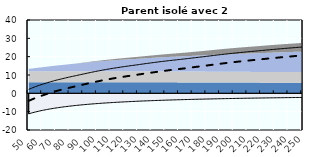
| Category | Coin fiscal moyen (somme des composantes) | Taux moyen d'imposition net en % du salaire brut |
|---|---|---|
| 50.0 | 2.171 | -4.09 |
| 51.0 | 2.46 | -3.783 |
| 52.0 | 2.765 | -3.458 |
| 53.0 | 3.078 | -3.125 |
| 54.0 | 3.364 | -2.821 |
| 55.0 | 3.654 | -2.512 |
| 56.0 | 3.92 | -2.229 |
| 57.0 | 4.19 | -1.941 |
| 58.0 | 4.452 | -1.663 |
| 59.0 | 4.69 | -1.41 |
| 60.0 | 4.934 | -1.15 |
| 61.0 | 5.171 | -0.898 |
| 62.0 | 5.386 | -0.669 |
| 63.0 | 5.624 | -0.416 |
| 64.0 | 5.867 | -0.158 |
| 65.0 | 6.086 | 0.076 |
| 66.0 | 6.315 | 0.319 |
| 67.0 | 6.537 | 0.555 |
| 68.0 | 6.737 | 0.768 |
| 69.0 | 6.946 | 0.991 |
| 70.0 | 7.149 | 1.207 |
| 71.0 | 7.332 | 1.402 |
| 72.0 | 7.511 | 1.591 |
| 73.0 | 7.698 | 1.79 |
| 74.0 | 7.866 | 1.969 |
| 75.0 | 8.046 | 2.161 |
| 76.0 | 8.227 | 2.353 |
| 77.0 | 8.403 | 2.54 |
| 78.0 | 8.59 | 2.74 |
| 79.0 | 8.757 | 2.917 |
| 80.0 | 8.92 | 3.09 |
| 81.0 | 9.093 | 3.275 |
| 82.0 | 9.248 | 3.44 |
| 83.0 | 9.399 | 3.601 |
| 84.0 | 9.561 | 3.773 |
| 85.0 | 9.714 | 3.936 |
| 86.0 | 9.898 | 4.132 |
| 87.0 | 10.06 | 4.304 |
| 88.0 | 10.219 | 4.473 |
| 89.0 | 10.391 | 4.656 |
| 90.0 | 10.542 | 4.817 |
| 91.0 | 10.69 | 4.974 |
| 92.0 | 10.86 | 5.155 |
| 93.0 | 11.019 | 5.324 |
| 94.0 | 11.175 | 5.49 |
| 95.0 | 11.345 | 5.671 |
| 96.0 | 11.494 | 5.829 |
| 97.0 | 11.64 | 5.984 |
| 98.0 | 11.8 | 6.155 |
| 99.0 | 11.94 | 6.304 |
| 100.0 | 12.095 | 6.469 |
| 101.0 | 12.237 | 6.62 |
| 102.0 | 12.376 | 6.768 |
| 103.0 | 12.529 | 6.931 |
| 104.0 | 12.662 | 7.073 |
| 105.0 | 12.793 | 7.212 |
| 106.0 | 12.938 | 7.366 |
| 107.0 | 13.064 | 7.5 |
| 108.0 | 13.187 | 7.631 |
| 109.0 | 13.325 | 7.777 |
| 110.0 | 13.443 | 7.904 |
| 111.0 | 13.576 | 8.045 |
| 112.0 | 13.69 | 8.167 |
| 113.0 | 13.803 | 8.286 |
| 114.0 | 13.929 | 8.42 |
| 115.0 | 14.037 | 8.536 |
| 116.0 | 14.144 | 8.649 |
| 117.0 | 14.264 | 8.776 |
| 118.0 | 14.368 | 8.887 |
| 119.0 | 14.475 | 9.002 |
| 120.0 | 14.596 | 9.13 |
| 121.0 | 14.7 | 9.241 |
| 122.0 | 14.817 | 9.366 |
| 123.0 | 14.917 | 9.472 |
| 124.0 | 15.016 | 9.577 |
| 125.0 | 15.128 | 9.696 |
| 126.0 | 15.223 | 9.797 |
| 127.0 | 15.317 | 9.897 |
| 128.0 | 15.424 | 10.011 |
| 129.0 | 15.522 | 10.116 |
| 130.0 | 15.624 | 10.224 |
| 131.0 | 15.74 | 10.348 |
| 132.0 | 15.839 | 10.453 |
| 133.0 | 15.952 | 10.573 |
| 134.0 | 16.051 | 10.678 |
| 135.0 | 16.15 | 10.784 |
| 136.0 | 16.265 | 10.906 |
| 137.0 | 16.361 | 11.008 |
| 138.0 | 16.457 | 11.11 |
| 139.0 | 16.566 | 11.226 |
| 140.0 | 16.658 | 11.325 |
| 141.0 | 16.75 | 11.421 |
| 142.0 | 16.855 | 11.533 |
| 143.0 | 16.958 | 11.644 |
| 144.0 | 17.045 | 11.736 |
| 145.0 | 17.146 | 11.844 |
| 146.0 | 17.246 | 11.95 |
| 147.0 | 17.33 | 12.039 |
| 148.0 | 17.426 | 12.145 |
| 149.0 | 17.52 | 12.248 |
| 150.0 | 17.598 | 12.334 |
| 151.0 | 17.69 | 12.436 |
| 152.0 | 17.781 | 12.535 |
| 153.0 | 17.87 | 12.634 |
| 154.0 | 17.944 | 12.715 |
| 155.0 | 18.032 | 12.811 |
| 156.0 | 18.118 | 12.906 |
| 157.0 | 18.189 | 12.984 |
| 158.0 | 18.275 | 13.079 |
| 159.0 | 18.363 | 13.176 |
| 160.0 | 18.436 | 13.256 |
| 161.0 | 18.522 | 13.35 |
| 162.0 | 18.607 | 13.444 |
| 163.0 | 18.692 | 13.536 |
| 164.0 | 18.761 | 13.612 |
| 165.0 | 18.85 | 13.71 |
| 166.0 | 18.943 | 13.811 |
| 167.0 | 19.022 | 13.898 |
| 168.0 | 19.117 | 14.001 |
| 169.0 | 19.211 | 14.104 |
| 170.0 | 19.304 | 14.205 |
| 171.0 | 19.38 | 14.289 |
| 172.0 | 19.471 | 14.388 |
| 173.0 | 19.563 | 14.488 |
| 174.0 | 19.641 | 14.573 |
| 175.0 | 19.733 | 14.674 |
| 176.0 | 19.825 | 14.773 |
| 177.0 | 19.9 | 14.855 |
| 178.0 | 19.993 | 14.957 |
| 179.0 | 20.087 | 15.058 |
| 180.0 | 20.182 | 15.162 |
| 181.0 | 20.262 | 15.249 |
| 182.0 | 20.359 | 15.354 |
| 183.0 | 20.457 | 15.461 |
| 184.0 | 20.538 | 15.549 |
| 185.0 | 20.635 | 15.653 |
| 186.0 | 20.73 | 15.757 |
| 187.0 | 20.825 | 15.859 |
| 188.0 | 20.902 | 15.943 |
| 189.0 | 20.994 | 16.044 |
| 190.0 | 21.086 | 16.143 |
| 191.0 | 21.161 | 16.224 |
| 192.0 | 21.25 | 16.321 |
| 193.0 | 21.339 | 16.418 |
| 194.0 | 21.411 | 16.496 |
| 195.0 | 21.499 | 16.591 |
| 196.0 | 21.585 | 16.684 |
| 197.0 | 21.67 | 16.777 |
| 198.0 | 21.739 | 16.852 |
| 199.0 | 21.823 | 16.942 |
| 200.0 | 21.906 | 17.032 |
| 201.0 | 21.973 | 17.105 |
| 202.0 | 22.054 | 17.193 |
| 203.0 | 22.135 | 17.28 |
| 204.0 | 22.214 | 17.367 |
| 205.0 | 22.279 | 17.437 |
| 206.0 | 22.357 | 17.521 |
| 207.0 | 22.434 | 17.605 |
| 208.0 | 22.496 | 17.673 |
| 209.0 | 22.573 | 17.755 |
| 210.0 | 22.648 | 17.837 |
| 211.0 | 22.708 | 17.902 |
| 212.0 | 22.782 | 17.983 |
| 213.0 | 22.856 | 18.062 |
| 214.0 | 22.928 | 18.141 |
| 215.0 | 22.986 | 18.204 |
| 216.0 | 23.058 | 18.281 |
| 217.0 | 23.128 | 18.358 |
| 218.0 | 23.187 | 18.422 |
| 219.0 | 23.265 | 18.506 |
| 220.0 | 23.342 | 18.589 |
| 221.0 | 23.419 | 18.672 |
| 222.0 | 23.48 | 18.738 |
| 223.0 | 23.555 | 18.819 |
| 224.0 | 23.63 | 18.9 |
| 225.0 | 23.689 | 18.964 |
| 226.0 | 23.762 | 19.043 |
| 227.0 | 23.835 | 19.122 |
| 228.0 | 23.893 | 19.184 |
| 229.0 | 23.964 | 19.261 |
| 230.0 | 24.035 | 19.338 |
| 231.0 | 24.105 | 19.414 |
| 232.0 | 24.161 | 19.474 |
| 233.0 | 24.23 | 19.548 |
| 234.0 | 24.298 | 19.622 |
| 235.0 | 24.352 | 19.681 |
| 236.0 | 24.42 | 19.754 |
| 237.0 | 24.486 | 19.826 |
| 238.0 | 24.553 | 19.897 |
| 239.0 | 24.605 | 19.954 |
| 240.0 | 24.67 | 20.024 |
| 241.0 | 24.735 | 20.094 |
| 242.0 | 24.785 | 20.149 |
| 243.0 | 24.849 | 20.218 |
| 244.0 | 24.912 | 20.286 |
| 245.0 | 24.962 | 20.339 |
| 246.0 | 25.024 | 20.406 |
| 247.0 | 25.085 | 20.473 |
| 248.0 | 25.147 | 20.539 |
| 249.0 | 25.194 | 20.591 |
| 250.0 | 25.254 | 20.656 |